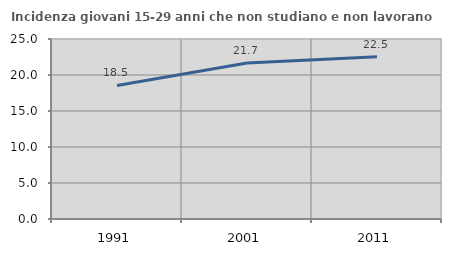
| Category | Incidenza giovani 15-29 anni che non studiano e non lavorano  |
|---|---|
| 1991.0 | 18.543 |
| 2001.0 | 21.667 |
| 2011.0 | 22.523 |